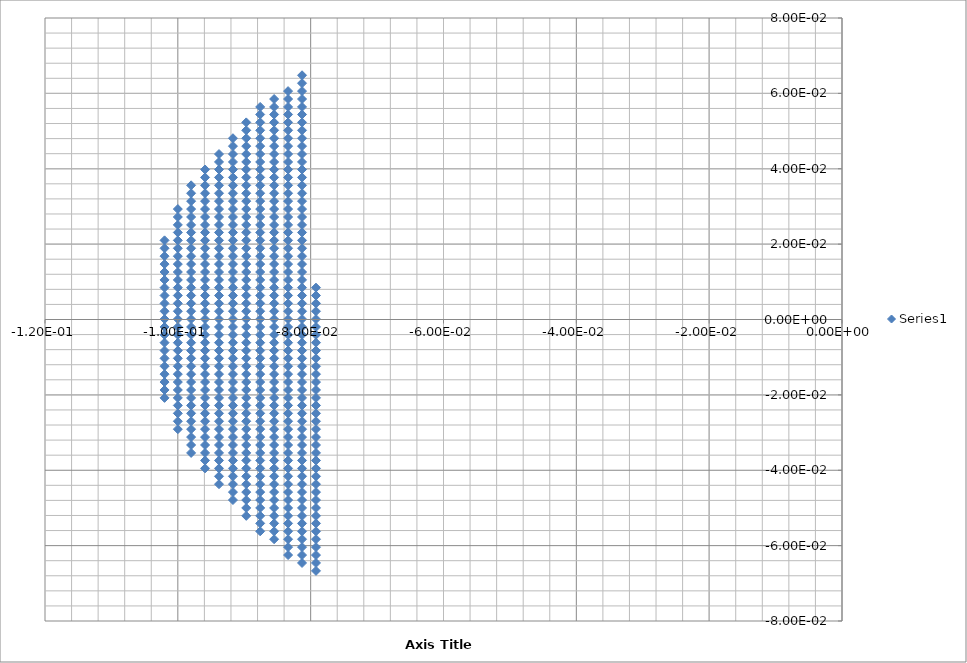
| Category | Series 0 |
|---|---|
| -0.102 | -0.021 |
| -0.102 | -0.019 |
| -0.102 | -0.017 |
| -0.102 | -0.014 |
| -0.102 | -0.012 |
| -0.102 | -0.01 |
| -0.102 | -0.008 |
| -0.102 | -0.006 |
| -0.102 | -0.004 |
| -0.102 | -0.002 |
| -0.102 | 0 |
| -0.102 | 0.002 |
| -0.102 | 0.004 |
| -0.102 | 0.006 |
| -0.102 | 0.008 |
| -0.102 | 0.01 |
| -0.102 | 0.013 |
| -0.102 | 0.015 |
| -0.102 | 0.017 |
| -0.102 | 0.019 |
| -0.102 | 0.021 |
| -0.1 | -0.029 |
| -0.1 | -0.027 |
| -0.1 | -0.025 |
| -0.1 | -0.023 |
| -0.1 | -0.021 |
| -0.1 | -0.019 |
| -0.1 | -0.017 |
| -0.1 | -0.014 |
| -0.1 | -0.012 |
| -0.1 | -0.01 |
| -0.1 | -0.008 |
| -0.1 | -0.006 |
| -0.1 | -0.004 |
| -0.1 | -0.002 |
| -0.1 | 0 |
| -0.1 | 0.002 |
| -0.1 | 0.004 |
| -0.1 | 0.006 |
| -0.1 | 0.008 |
| -0.1 | 0.01 |
| -0.1 | 0.013 |
| -0.1 | 0.015 |
| -0.1 | 0.017 |
| -0.1 | 0.019 |
| -0.1 | 0.021 |
| -0.1 | 0.023 |
| -0.1 | 0.025 |
| -0.1 | 0.027 |
| -0.1 | 0.029 |
| -0.098 | -0.035 |
| -0.098 | -0.033 |
| -0.098 | -0.031 |
| -0.098 | -0.029 |
| -0.098 | -0.027 |
| -0.098 | -0.025 |
| -0.098 | -0.023 |
| -0.098 | -0.021 |
| -0.098 | -0.019 |
| -0.098 | -0.017 |
| -0.098 | -0.014 |
| -0.098 | -0.012 |
| -0.098 | -0.01 |
| -0.098 | -0.008 |
| -0.098 | -0.006 |
| -0.098 | -0.004 |
| -0.098 | -0.002 |
| -0.098 | 0 |
| -0.098 | 0.002 |
| -0.098 | 0.004 |
| -0.098 | 0.006 |
| -0.098 | 0.008 |
| -0.098 | 0.01 |
| -0.098 | 0.013 |
| -0.098 | 0.015 |
| -0.098 | 0.017 |
| -0.098 | 0.019 |
| -0.098 | 0.021 |
| -0.098 | 0.023 |
| -0.098 | 0.025 |
| -0.098 | 0.027 |
| -0.098 | 0.029 |
| -0.098 | 0.031 |
| -0.098 | 0.034 |
| -0.098 | 0.036 |
| -0.0959 | -0.04 |
| -0.0959 | -0.037 |
| -0.0959 | -0.035 |
| -0.0959 | -0.033 |
| -0.0959 | -0.031 |
| -0.0959 | -0.029 |
| -0.0959 | -0.027 |
| -0.0959 | -0.025 |
| -0.0959 | -0.023 |
| -0.0959 | -0.021 |
| -0.0959 | -0.019 |
| -0.0959 | -0.017 |
| -0.0959 | -0.014 |
| -0.0959 | -0.012 |
| -0.0959 | -0.01 |
| -0.0959 | -0.008 |
| -0.0959 | -0.006 |
| -0.0959 | -0.004 |
| -0.0959 | -0.002 |
| -0.0959 | 0 |
| -0.0959 | 0.002 |
| -0.0959 | 0.004 |
| -0.0959 | 0.006 |
| -0.0959 | 0.008 |
| -0.0959 | 0.01 |
| -0.0959 | 0.013 |
| -0.0959 | 0.015 |
| -0.0959 | 0.017 |
| -0.0959 | 0.019 |
| -0.0959 | 0.021 |
| -0.0959 | 0.023 |
| -0.0959 | 0.025 |
| -0.0959 | 0.027 |
| -0.0959 | 0.029 |
| -0.0959 | 0.031 |
| -0.0959 | 0.034 |
| -0.0959 | 0.036 |
| -0.0959 | 0.038 |
| -0.0959 | 0.04 |
| -0.0938 | -0.044 |
| -0.0938 | -0.042 |
| -0.0938 | -0.04 |
| -0.0938 | -0.037 |
| -0.0938 | -0.035 |
| -0.0938 | -0.033 |
| -0.0938 | -0.031 |
| -0.0938 | -0.029 |
| -0.0938 | -0.027 |
| -0.0938 | -0.025 |
| -0.0938 | -0.023 |
| -0.0938 | -0.021 |
| -0.0938 | -0.019 |
| -0.0938 | -0.017 |
| -0.0938 | -0.014 |
| -0.0938 | -0.012 |
| -0.0938 | -0.01 |
| -0.0938 | -0.008 |
| -0.0938 | -0.006 |
| -0.0938 | -0.004 |
| -0.0938 | -0.002 |
| -0.0938 | 0 |
| -0.0938 | 0.002 |
| -0.0938 | 0.004 |
| -0.0938 | 0.006 |
| -0.0938 | 0.008 |
| -0.0938 | 0.01 |
| -0.0938 | 0.013 |
| -0.0938 | 0.015 |
| -0.0938 | 0.017 |
| -0.0938 | 0.019 |
| -0.0938 | 0.021 |
| -0.0938 | 0.023 |
| -0.0938 | 0.025 |
| -0.0938 | 0.027 |
| -0.0938 | 0.029 |
| -0.0938 | 0.031 |
| -0.0938 | 0.034 |
| -0.0938 | 0.036 |
| -0.0938 | 0.038 |
| -0.0938 | 0.04 |
| -0.0938 | 0.042 |
| -0.0938 | 0.044 |
| -0.0917 | -0.048 |
| -0.0917 | -0.046 |
| -0.0917 | -0.044 |
| -0.0917 | -0.042 |
| -0.0917 | -0.04 |
| -0.0917 | -0.037 |
| -0.0917 | -0.035 |
| -0.0917 | -0.033 |
| -0.0917 | -0.031 |
| -0.0917 | -0.029 |
| -0.0917 | -0.027 |
| -0.0917 | -0.025 |
| -0.0917 | -0.023 |
| -0.0917 | -0.021 |
| -0.0917 | -0.019 |
| -0.0917 | -0.017 |
| -0.0917 | -0.014 |
| -0.0917 | -0.012 |
| -0.0917 | -0.01 |
| -0.0917 | -0.008 |
| -0.0917 | -0.006 |
| -0.0917 | -0.004 |
| -0.0917 | -0.002 |
| -0.0917 | 0 |
| -0.0917 | 0.002 |
| -0.0917 | 0.004 |
| -0.0917 | 0.006 |
| -0.0917 | 0.008 |
| -0.0917 | 0.01 |
| -0.0917 | 0.013 |
| -0.0917 | 0.015 |
| -0.0917 | 0.017 |
| -0.0917 | 0.019 |
| -0.0917 | 0.021 |
| -0.0917 | 0.023 |
| -0.0917 | 0.025 |
| -0.0917 | 0.027 |
| -0.0917 | 0.029 |
| -0.0917 | 0.031 |
| -0.0917 | 0.034 |
| -0.0917 | 0.036 |
| -0.0917 | 0.038 |
| -0.0917 | 0.04 |
| -0.0917 | 0.042 |
| -0.0917 | 0.044 |
| -0.0917 | 0.046 |
| -0.0917 | 0.048 |
| -0.0897 | -0.052 |
| -0.0897 | -0.05 |
| -0.0897 | -0.048 |
| -0.0897 | -0.046 |
| -0.0897 | -0.044 |
| -0.0897 | -0.042 |
| -0.0897 | -0.04 |
| -0.0897 | -0.037 |
| -0.0897 | -0.035 |
| -0.0897 | -0.033 |
| -0.0897 | -0.031 |
| -0.0897 | -0.029 |
| -0.0897 | -0.027 |
| -0.0897 | -0.025 |
| -0.0897 | -0.023 |
| -0.0897 | -0.021 |
| -0.0897 | -0.019 |
| -0.0897 | -0.017 |
| -0.0897 | -0.014 |
| -0.0897 | -0.012 |
| -0.0897 | -0.01 |
| -0.0897 | -0.008 |
| -0.0897 | -0.006 |
| -0.0897 | -0.004 |
| -0.0897 | -0.002 |
| -0.0897 | 0 |
| -0.0897 | 0.002 |
| -0.0897 | 0.004 |
| -0.0897 | 0.006 |
| -0.0897 | 0.008 |
| -0.0897 | 0.01 |
| -0.0897 | 0.013 |
| -0.0897 | 0.015 |
| -0.0897 | 0.017 |
| -0.0897 | 0.019 |
| -0.0897 | 0.021 |
| -0.0897 | 0.023 |
| -0.0897 | 0.025 |
| -0.0897 | 0.027 |
| -0.0897 | 0.029 |
| -0.0897 | 0.031 |
| -0.0897 | 0.034 |
| -0.0897 | 0.036 |
| -0.0897 | 0.038 |
| -0.0897 | 0.04 |
| -0.0897 | 0.042 |
| -0.0897 | 0.044 |
| -0.0897 | 0.046 |
| -0.0897 | 0.048 |
| -0.0897 | 0.05 |
| -0.0897 | 0.052 |
| -0.0876 | -0.056 |
| -0.0876 | -0.054 |
| -0.0876 | -0.052 |
| -0.0876 | -0.05 |
| -0.0876 | -0.048 |
| -0.0876 | -0.046 |
| -0.0876 | -0.044 |
| -0.0876 | -0.042 |
| -0.0876 | -0.04 |
| -0.0876 | -0.037 |
| -0.0876 | -0.035 |
| -0.0876 | -0.033 |
| -0.0876 | -0.031 |
| -0.0876 | -0.029 |
| -0.0876 | -0.027 |
| -0.0876 | -0.025 |
| -0.0876 | -0.023 |
| -0.0876 | -0.021 |
| -0.0876 | -0.019 |
| -0.0876 | -0.017 |
| -0.0876 | -0.014 |
| -0.0876 | -0.012 |
| -0.0876 | -0.01 |
| -0.0876 | -0.008 |
| -0.0876 | -0.006 |
| -0.0876 | -0.004 |
| -0.0876 | -0.002 |
| -0.0876 | 0 |
| -0.0876 | 0.002 |
| -0.0876 | 0.004 |
| -0.0876 | 0.006 |
| -0.0876 | 0.008 |
| -0.0876 | 0.01 |
| -0.0876 | 0.013 |
| -0.0876 | 0.015 |
| -0.0876 | 0.017 |
| -0.0876 | 0.019 |
| -0.0876 | 0.021 |
| -0.0876 | 0.023 |
| -0.0876 | 0.025 |
| -0.0876 | 0.027 |
| -0.0876 | 0.029 |
| -0.0876 | 0.031 |
| -0.0876 | 0.034 |
| -0.0876 | 0.036 |
| -0.0876 | 0.038 |
| -0.0876 | 0.04 |
| -0.0876 | 0.042 |
| -0.0876 | 0.044 |
| -0.0876 | 0.046 |
| -0.0876 | 0.048 |
| -0.0876 | 0.05 |
| -0.0876 | 0.052 |
| -0.0876 | 0.054 |
| -0.0876 | 0.056 |
| -0.0855 | -0.058 |
| -0.0855 | -0.056 |
| -0.0855 | -0.054 |
| -0.0855 | -0.052 |
| -0.0855 | -0.05 |
| -0.0855 | -0.048 |
| -0.0855 | -0.046 |
| -0.0855 | -0.044 |
| -0.0855 | -0.042 |
| -0.0855 | -0.04 |
| -0.0855 | -0.037 |
| -0.0855 | -0.035 |
| -0.0855 | -0.033 |
| -0.0855 | -0.031 |
| -0.0855 | -0.029 |
| -0.0855 | -0.027 |
| -0.0855 | -0.025 |
| -0.0855 | -0.023 |
| -0.0855 | -0.021 |
| -0.0855 | -0.019 |
| -0.0855 | -0.017 |
| -0.0855 | -0.014 |
| -0.0855 | -0.012 |
| -0.0855 | -0.01 |
| -0.0855 | -0.008 |
| -0.0855 | -0.006 |
| -0.0855 | -0.004 |
| -0.0855 | -0.002 |
| -0.0855 | 0 |
| -0.0855 | 0.002 |
| -0.0855 | 0.004 |
| -0.0855 | 0.006 |
| -0.0855 | 0.008 |
| -0.0855 | 0.01 |
| -0.0855 | 0.013 |
| -0.0855 | 0.015 |
| -0.0855 | 0.017 |
| -0.0855 | 0.019 |
| -0.0855 | 0.021 |
| -0.0855 | 0.023 |
| -0.0855 | 0.025 |
| -0.0855 | 0.027 |
| -0.0855 | 0.029 |
| -0.0855 | 0.031 |
| -0.0855 | 0.034 |
| -0.0855 | 0.036 |
| -0.0855 | 0.038 |
| -0.0855 | 0.04 |
| -0.0855 | 0.042 |
| -0.0855 | 0.044 |
| -0.0855 | 0.046 |
| -0.0855 | 0.048 |
| -0.0855 | 0.05 |
| -0.0855 | 0.052 |
| -0.0855 | 0.054 |
| -0.0855 | 0.056 |
| -0.0855 | 0.058 |
| -0.0834 | -0.062 |
| -0.0834 | -0.06 |
| -0.0834 | -0.058 |
| -0.0834 | -0.056 |
| -0.0834 | -0.054 |
| -0.0834 | -0.052 |
| -0.0834 | -0.05 |
| -0.0834 | -0.048 |
| -0.0834 | -0.046 |
| -0.0834 | -0.044 |
| -0.0834 | -0.042 |
| -0.0834 | -0.04 |
| -0.0834 | -0.037 |
| -0.0834 | -0.035 |
| -0.0834 | -0.033 |
| -0.0834 | -0.031 |
| -0.0834 | -0.029 |
| -0.0834 | -0.027 |
| -0.0834 | -0.025 |
| -0.0834 | -0.023 |
| -0.0834 | -0.021 |
| -0.0834 | -0.019 |
| -0.0834 | -0.017 |
| -0.0834 | -0.014 |
| -0.0834 | -0.012 |
| -0.0834 | -0.01 |
| -0.0834 | -0.008 |
| -0.0834 | -0.006 |
| -0.0834 | -0.004 |
| -0.0834 | -0.002 |
| -0.0834 | 0 |
| -0.0834 | 0.002 |
| -0.0834 | 0.004 |
| -0.0834 | 0.006 |
| -0.0834 | 0.008 |
| -0.0834 | 0.01 |
| -0.0834 | 0.013 |
| -0.0834 | 0.015 |
| -0.0834 | 0.017 |
| -0.0834 | 0.019 |
| -0.0834 | 0.021 |
| -0.0834 | 0.023 |
| -0.0834 | 0.025 |
| -0.0834 | 0.027 |
| -0.0834 | 0.029 |
| -0.0834 | 0.031 |
| -0.0834 | 0.034 |
| -0.0834 | 0.036 |
| -0.0834 | 0.038 |
| -0.0834 | 0.04 |
| -0.0834 | 0.042 |
| -0.0834 | 0.044 |
| -0.0834 | 0.046 |
| -0.0834 | 0.048 |
| -0.0834 | 0.05 |
| -0.0834 | 0.052 |
| -0.0834 | 0.054 |
| -0.0834 | 0.056 |
| -0.0834 | 0.058 |
| -0.0834 | 0.061 |
| -0.0813 | -0.065 |
| -0.0813 | -0.062 |
| -0.0813 | -0.06 |
| -0.0813 | -0.058 |
| -0.0813 | -0.056 |
| -0.0813 | -0.054 |
| -0.0813 | -0.052 |
| -0.0813 | -0.05 |
| -0.0813 | -0.048 |
| -0.0813 | -0.046 |
| -0.0813 | -0.044 |
| -0.0813 | -0.042 |
| -0.0813 | -0.04 |
| -0.0813 | -0.037 |
| -0.0813 | -0.035 |
| -0.0813 | -0.033 |
| -0.0813 | -0.031 |
| -0.0813 | -0.029 |
| -0.0813 | -0.027 |
| -0.0813 | -0.025 |
| -0.0813 | -0.023 |
| -0.0813 | -0.021 |
| -0.0813 | -0.019 |
| -0.0813 | -0.017 |
| -0.0813 | -0.014 |
| -0.0813 | -0.012 |
| -0.0813 | -0.01 |
| -0.0813 | -0.008 |
| -0.0813 | -0.006 |
| -0.0813 | -0.004 |
| -0.0813 | -0.002 |
| -0.0813 | 0 |
| -0.0813 | 0.002 |
| -0.0813 | 0.004 |
| -0.0813 | 0.006 |
| -0.0813 | 0.008 |
| -0.0813 | 0.01 |
| -0.0813 | 0.013 |
| -0.0813 | 0.015 |
| -0.0813 | 0.017 |
| -0.0813 | 0.019 |
| -0.0813 | 0.021 |
| -0.0813 | 0.023 |
| -0.0813 | 0.025 |
| -0.0813 | 0.027 |
| -0.0813 | 0.029 |
| -0.0813 | 0.031 |
| -0.0813 | 0.034 |
| -0.0813 | 0.036 |
| -0.0813 | 0.038 |
| -0.0813 | 0.04 |
| -0.0813 | 0.042 |
| -0.0813 | 0.044 |
| -0.0813 | 0.046 |
| -0.0813 | 0.048 |
| -0.0813 | 0.05 |
| -0.0813 | 0.052 |
| -0.0813 | 0.054 |
| -0.0813 | 0.056 |
| -0.0813 | 0.058 |
| -0.0813 | 0.061 |
| -0.0813 | 0.063 |
| -0.0813 | 0.065 |
| -0.0792 | -0.067 |
| -0.0792 | -0.065 |
| -0.0792 | -0.062 |
| -0.0792 | -0.06 |
| -0.0792 | -0.058 |
| -0.0792 | -0.056 |
| -0.0792 | -0.054 |
| -0.0792 | -0.052 |
| -0.0792 | -0.05 |
| -0.0792 | -0.048 |
| -0.0792 | -0.046 |
| -0.0792 | -0.044 |
| -0.0792 | -0.042 |
| -0.0792 | -0.04 |
| -0.0792 | -0.037 |
| -0.0792 | -0.035 |
| -0.0792 | -0.033 |
| -0.0792 | -0.031 |
| -0.0792 | -0.029 |
| -0.0792 | -0.027 |
| -0.0792 | -0.025 |
| -0.0792 | -0.023 |
| -0.0792 | -0.021 |
| -0.0792 | -0.019 |
| -0.0792 | -0.017 |
| -0.0792 | -0.014 |
| -0.0792 | -0.012 |
| -0.0792 | -0.01 |
| -0.0792 | -0.008 |
| -0.0792 | -0.006 |
| -0.0792 | -0.004 |
| -0.0792 | -0.002 |
| -0.0792 | 0 |
| -0.0792 | 0.002 |
| -0.0792 | 0.004 |
| -0.0792 | 0.006 |
| -0.0792 | 0.008 |